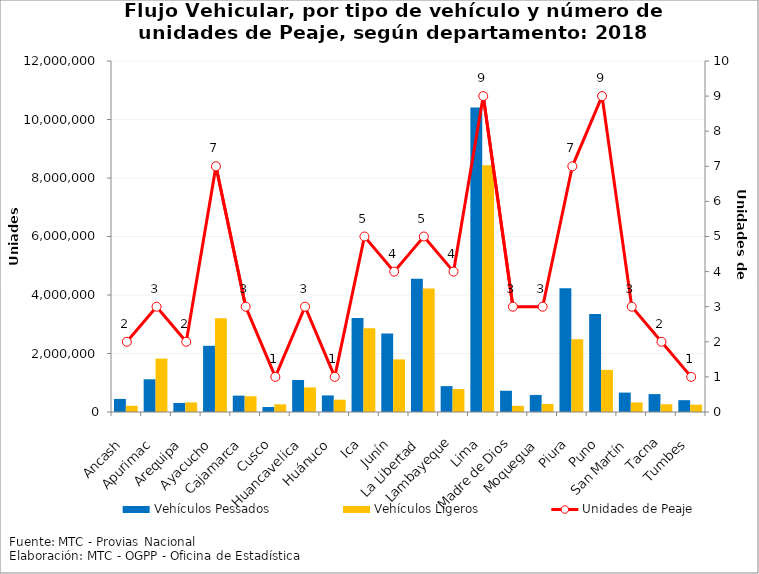
| Category | Vehículos Pessados | Vehículos Ligeros |
|---|---|---|
| 0 | 446833 | 213821 |
| 1 | 1117633 | 1826667 |
| 2 | 309872 | 327340 |
| 3 | 2263571 | 3206758 |
| 4 | 559718 | 538786 |
| 5 | 170075 | 263133 |
| 6 | 1094228 | 839618 |
| 7 | 566749 | 420877 |
| 8 | 3212516 | 2860723 |
| 9 | 2680627 | 1798266 |
| 10 | 4554595 | 4224398 |
| 11 | 884444 | 784076 |
| 12 | 10407627 | 8438095 |
| 13 | 725934 | 211860 |
| 14 | 582714 | 272736 |
| 15 | 4228786 | 2484081 |
| 16 | 3348228 | 1439904 |
| 17 | 663456 | 326991 |
| 18 | 612527 | 263662 |
| 19 | 404096 | 250784 |